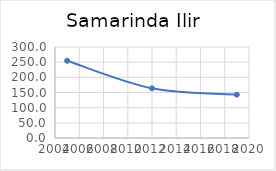
| Category | Series 0 |
|---|---|
| 2005.0 | 254.7 |
| 2012.0 | 163.728 |
| 2019.0 | 142.699 |